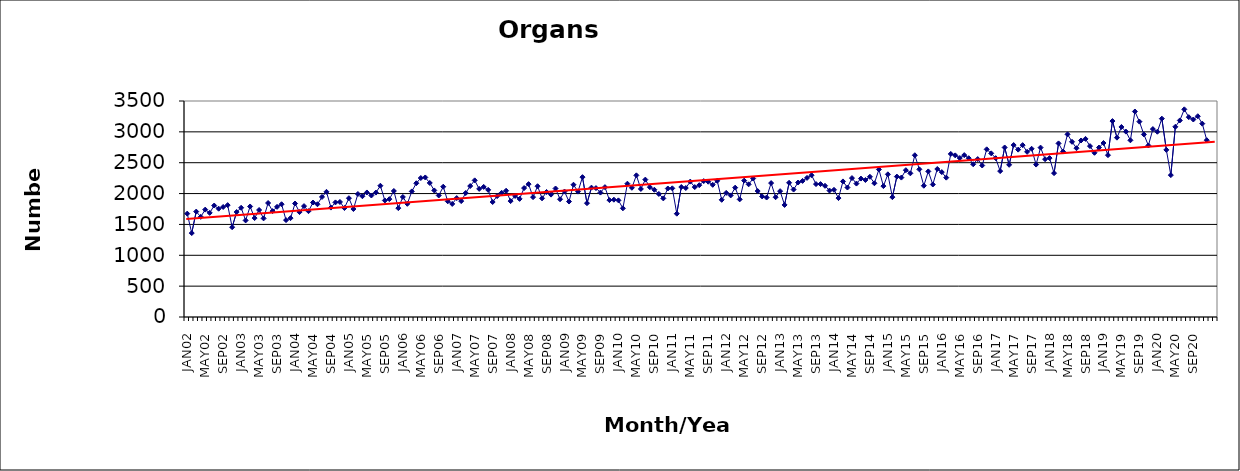
| Category | Series 0 |
|---|---|
| JAN02 | 1675 |
| FEB02 | 1360 |
| MAR02 | 1708 |
| APR02 | 1623 |
| MAY02 | 1740 |
| JUN02 | 1687 |
| JUL02 | 1806 |
| AUG02 | 1755 |
| SEP02 | 1783 |
| OCT02 | 1813 |
| NOV02 | 1455 |
| DEC02 | 1701 |
| JAN03 | 1770 |
| FEB03 | 1565 |
| MAR03 | 1791 |
| APR03 | 1603 |
| MAY03 | 1734 |
| JUN03 | 1598 |
| JUL03 | 1847 |
| AUG03 | 1716 |
| SEP03 | 1785 |
| OCT03 | 1827 |
| NOV03 | 1570 |
| DEC03 | 1602 |
| JAN04 | 1839 |
| FEB04 | 1700 |
| MAR04 | 1797 |
| APR04 | 1715 |
| MAY04 | 1855 |
| JUN04 | 1827 |
| JUL04 | 1945 |
| AUG04 | 2028 |
| SEP04 | 1773 |
| OCT04 | 1857 |
| NOV04 | 1864 |
| DEC04 | 1766 |
| JAN05 | 1925 |
| FEB05 | 1750 |
| MAR05 | 1993 |
| APR05 | 1957 |
| MAY05 | 2018 |
| JUN05 | 1969 |
| JUL05 | 2016 |
| AUG05 | 2127 |
| SEP05 | 1888 |
| OCT05 | 1910 |
| NOV05 | 2042 |
| DEC05 | 1764 |
| JAN06 | 1945 |
| FEB06 | 1834 |
| MAR06 | 2035 |
| APR06 | 2167 |
| MAY06 | 2252 |
| JUN06 | 2261 |
| JUL06 | 2172 |
| AUG06 | 2051 |
| SEP06 | 1969 |
| OCT06 | 2111 |
| NOV06 | 1875 |
| DEC06 | 1832 |
| JAN07 | 1927 |
| FEB07 | 1878 |
| MAR07 | 2009 |
| APR07 | 2122 |
| MAY07 | 2214 |
| JUN07 | 2076 |
| JUL07 | 2108 |
| AUG07 | 2060 |
| SEP07 | 1863 |
| OCT07 | 1959 |
| NOV07 | 2012 |
| DEC07 | 2046 |
| JAN08 | 1878 |
| FEB08 | 1962 |
| MAR08 | 1914 |
| APR08 | 2089 |
| MAY08 | 2153 |
| JUN08 | 1942 |
| JUL08 | 2119 |
| AUG08 | 1923 |
| SEP08 | 2026 |
| OCT08 | 1983 |
| NOV08 | 2082 |
| DEC08 | 1908 |
| JAN09 | 2033 |
| FEB09 | 1871 |
| MAR09 | 2143 |
| APR09 | 2032 |
| MAY09 | 2266 |
| JUN09 | 1844 |
| JUL09 | 2096 |
| AUG09 | 2089 |
| SEP09 | 2016 |
| OCT09 | 2104 |
| NOV09 | 1894 |
| DEC09 | 1901 |
| JAN10 | 1890 |
| FEB10 | 1761 |
| MAR10 | 2160 |
| APR10 | 2094 |
| MAY10 | 2295 |
| JUN10 | 2075 |
| JUL10 | 2226 |
| AUG10 | 2104 |
| SEP10 | 2062 |
| OCT10 | 1994 |
| NOV10 | 1922 |
| DEC10 | 2082 |
| JAN11 | 2085 |
| FEB11 | 1674 |
| MAR11 | 2106 |
| APR11 | 2090 |
| MAY11 | 2194 |
| JUN11 | 2105 |
| JUL11 | 2136 |
| AUG11 | 2202 |
| SEP11 | 2192 |
| OCT11 | 2142 |
| NOV11 | 2207 |
| DEC11 | 1899 |
| JAN12 | 2011 |
| FEB12 | 1970 |
| MAR12 | 2096 |
| APR12 | 1906 |
| MAY12 | 2210 |
| JUN12 | 2150 |
| JUL12 | 2244 |
| AUG12 | 2041 |
| SEP12 | 1954 |
| OCT12 | 1936 |
| NOV12 | 2170 |
| DEC12 | 1941 |
| JAN13 | 2039 |
| FEB13 | 1816 |
| MAR13 | 2175 |
| APR13 | 2065 |
| MAY13 | 2179 |
| JUN13 | 2205 |
| JUL13 | 2254 |
| AUG13 | 2297 |
| SEP13 | 2154 |
| OCT13 | 2154 |
| NOV13 | 2126 |
| DEC13 | 2049 |
| JAN14 | 2061 |
| FEB14 | 1927 |
| MAR14 | 2197 |
| APR14 | 2098 |
| MAY14 | 2251 |
| JUN14 | 2162 |
| JUL14 | 2243 |
| AUG14 | 2220 |
| SEP14 | 2272 |
| OCT14 | 2167 |
| NOV14 | 2391 |
| DEC14 | 2121 |
| JAN15 | 2312 |
| FEB15 | 1942 |
| MAR15 | 2275 |
| APR15 | 2259 |
| MAY15 | 2379 |
| JUN15 | 2328 |
| JUL15 | 2621 |
| AUG15 | 2393 |
| SEP15 | 2127 |
| OCT15 | 2359 |
| NOV15 | 2147 |
| DEC15 | 2398 |
| JAN16 | 2348 |
| FEB16 | 2258 |
| MAR16 | 2642 |
| APR16 | 2619 |
| MAY16 | 2576 |
| JUN16 | 2623 |
| JUL16 | 2573 |
| AUG16 | 2475 |
| SEP16 | 2559 |
| OCT16 | 2455 |
| NOV16 | 2717 |
| DEC16 | 2652 |
| JAN17 | 2574 |
| FEB17 | 2364 |
| MAR17 | 2747 |
| APR17 | 2466 |
| MAY17 | 2786 |
| JUN17 | 2712 |
| JUL17 | 2785 |
| AUG17 | 2676 |
| SEP17 | 2726 |
| OCT17 | 2470 |
| NOV17 | 2745 |
| DEC17 | 2557 |
| JAN18 | 2575 |
| FEB18 | 2331 |
| MAR18 | 2813 |
| APR18 | 2681 |
| MAY18 | 2960 |
| JUN18 | 2839 |
| JUL18 | 2735 |
| AUG18 | 2860 |
| SEP18 | 2886 |
| OCT18 | 2769 |
| NOV18 | 2661 |
| DEC18 | 2746 |
| JAN19 | 2819 |
| FEB19 | 2622 |
| MAR19 | 3175 |
| APR19 | 2906 |
| MAY19 | 3079 |
| JUN19 | 3004 |
| JUL19 | 2863 |
| AUG19 | 3330 |
| SEP19 | 3166 |
| OCT19 | 2958 |
| NOV19 | 2779 |
| DEC19 | 3045 |
| JAN20 | 3002 |
| FEB20 | 3214 |
| MAR20 | 2708 |
| APR20 | 2299 |
| MAY20 | 3082 |
| JUN20 | 3185 |
| JUL20 | 3365 |
| AUG20 | 3238 |
| SEP20 | 3200 |
| OCT20 | 3253 |
| NOV20 | 3133 |
| DEC20 | 2865 |